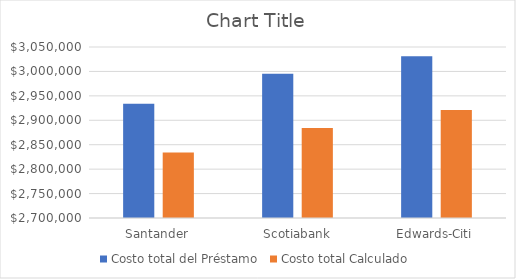
| Category | Costo total del Préstamo | Costo total Calculado |
|---|---|---|
| Santander | 2934000 | 2833848 |
| Scotiabank | 2995344 | 2884068 |
| Edwards-Citi | 3031020 | 2920896 |